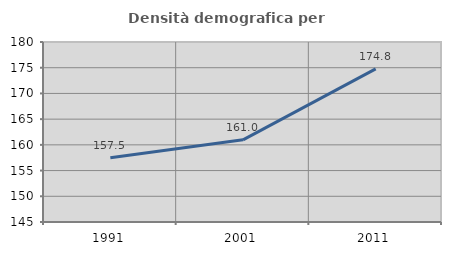
| Category | Densità demografica |
|---|---|
| 1991.0 | 157.472 |
| 2001.0 | 160.974 |
| 2011.0 | 174.775 |